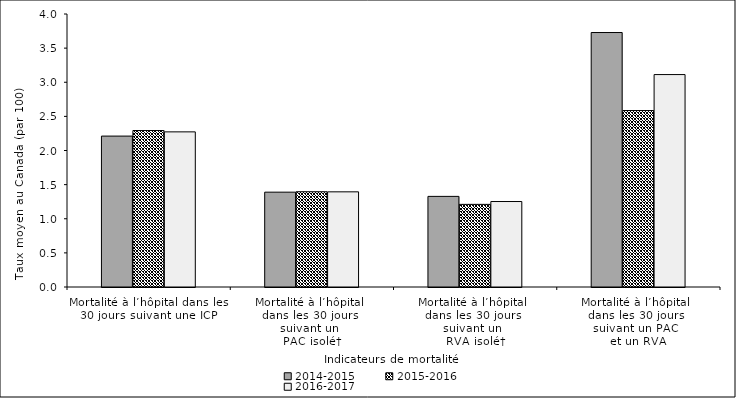
| Category | 2014-2015 | 2015-2016 | 2016-2017 |
|---|---|---|---|
| Mortalité à l’hôpital dans les 30 jours suivant une ICP | 2.211 | 2.293 | 2.273 |
| Mortalité à l’hôpital 
dans les 30 jours 
suivant un 
PAC isolé† | 1.39 | 1.396 | 1.394 |
| Mortalité à l’hôpital 
dans les 30 jours 
suivant un 
RVA isolé† | 1.328 | 1.211 | 1.252 |
| Mortalité à l’hôpital 
dans les 30 jours 
suivant un PAC 
et un RVA | 3.729 | 2.586 | 3.112 |